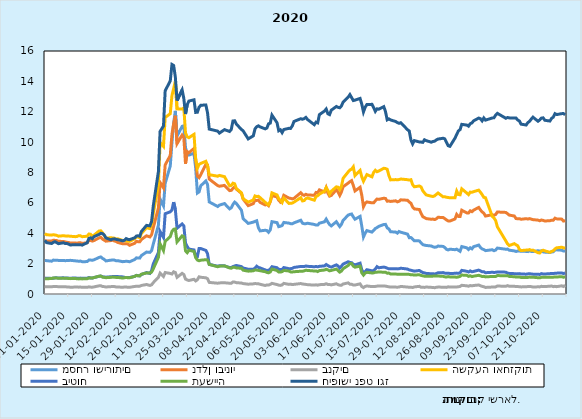
| Category | מסחר ושירותים | נדלן ובינוי | בנקים | השקעה ואחזקות | ביטוח | תעשייה | חיפושי נפט וגז |
|---|---|---|---|---|---|---|---|
| 2020-01-01 | 2.218 | 3.52 | 0.486 | 3.978 | 1.047 | 1.011 | 3.534 |
| 2020-01-02 | 2.195 | 3.485 | 0.48 | 3.903 | 1.035 | 1.005 | 3.383 |
| 2020-01-05 | 2.16 | 3.488 | 0.471 | 3.876 | 1.027 | 1.019 | 3.325 |
| 2020-01-06 | 2.231 | 3.538 | 0.494 | 3.905 | 1.039 | 1.056 | 3.4 |
| 2020-01-07 | 2.228 | 3.53 | 0.491 | 3.883 | 1.063 | 1.053 | 3.446 |
| 2020-01-08 | 2.229 | 3.52 | 0.49 | 3.862 | 1.062 | 1.057 | 3.381 |
| 2020-01-09 | 2.209 | 3.471 | 0.48 | 3.807 | 1.058 | 1.035 | 3.315 |
| 2020-01-12 | 2.21 | 3.457 | 0.483 | 3.838 | 1.063 | 1.038 | 3.373 |
| 2020-01-13 | 2.194 | 3.428 | 0.48 | 3.82 | 1.056 | 1.035 | 3.319 |
| 2020-01-14 | 2.201 | 3.403 | 0.464 | 3.81 | 1.047 | 1.029 | 3.323 |
| 2020-01-15 | 2.206 | 3.393 | 0.459 | 3.814 | 1.045 | 1.028 | 3.288 |
| 2020-01-16 | 2.217 | 3.356 | 0.448 | 3.804 | 1.042 | 1.012 | 3.229 |
| 2020-01-19 | 2.184 | 3.356 | 0.455 | 3.775 | 1.052 | 1.018 | 3.251 |
| 2020-01-20 | 2.168 | 3.346 | 0.463 | 3.789 | 1.042 | 1.002 | 3.235 |
| 2020-01-21 | 2.16 | 3.37 | 0.45 | 3.842 | 1.037 | 0.995 | 3.247 |
| 2020-01-22 | 2.166 | 3.374 | 0.458 | 3.83 | 1.046 | 1 | 3.247 |
| 2020-01-23 | 2.129 | 3.337 | 0.441 | 3.774 | 1.03 | 0.995 | 3.219 |
| 2020-01-26 | 2.133 | 3.371 | 0.442 | 3.805 | 1.04 | 1.004 | 3.378 |
| 2020-01-27 | 2.238 | 3.527 | 0.471 | 3.951 | 1.084 | 1.06 | 3.662 |
| 2020-01-28 | 2.235 | 3.525 | 0.453 | 3.933 | 1.056 | 1.055 | 3.702 |
| 2020-01-29 | 2.222 | 3.485 | 0.449 | 3.822 | 1.052 | 1.045 | 3.641 |
| 2020-01-30 | 2.251 | 3.52 | 0.467 | 3.876 | 1.084 | 1.083 | 3.779 |
| 2020-02-02 | 2.407 | 3.693 | 0.539 | 4.147 | 1.166 | 1.174 | 3.922 |
| 2020-02-03 | 2.441 | 3.733 | 0.543 | 4.159 | 1.184 | 1.183 | 3.999 |
| 2020-02-04 | 2.347 | 3.616 | 0.496 | 4.037 | 1.132 | 1.111 | 3.976 |
| 2020-02-05 | 2.283 | 3.548 | 0.484 | 3.877 | 1.122 | 1.097 | 3.891 |
| 2020-02-06 | 2.179 | 3.479 | 0.462 | 3.686 | 1.108 | 1.074 | 3.692 |
| 2020-02-09 | 2.228 | 3.519 | 0.485 | 3.702 | 1.136 | 1.096 | 3.568 |
| 2020-02-10 | 2.236 | 3.541 | 0.498 | 3.692 | 1.147 | 1.115 | 3.619 |
| 2020-02-11 | 2.234 | 3.49 | 0.488 | 3.678 | 1.145 | 1.104 | 3.632 |
| 2020-02-12 | 2.188 | 3.465 | 0.465 | 3.604 | 1.147 | 1.092 | 3.599 |
| 2020-02-13 | 2.195 | 3.393 | 0.465 | 3.635 | 1.147 | 1.093 | 3.576 |
| 2020-02-16 | 2.128 | 3.306 | 0.439 | 3.524 | 1.126 | 1.049 | 3.5 |
| 2020-02-17 | 2.144 | 3.307 | 0.464 | 3.511 | 1.097 | 1.073 | 3.544 |
| 2020-02-18 | 2.154 | 3.316 | 0.459 | 3.511 | 1.089 | 1.089 | 3.648 |
| 2020-02-19 | 2.146 | 3.292 | 0.444 | 3.475 | 1.085 | 1.068 | 3.595 |
| 2020-02-20 | 2.123 | 3.207 | 0.441 | 3.465 | 1.085 | 1.068 | 3.578 |
| 2020-02-23 | 2.271 | 3.339 | 0.497 | 3.629 | 1.16 | 1.161 | 3.702 |
| 2020-02-24 | 2.38 | 3.464 | 0.511 | 3.779 | 1.226 | 1.222 | 3.816 |
| 2020-02-25 | 2.372 | 3.441 | 0.501 | 3.744 | 1.206 | 1.194 | 3.834 |
| 2020-02-26 | 2.364 | 3.437 | 0.513 | 3.703 | 1.188 | 1.205 | 3.798 |
| 2020-02-27 | 2.532 | 3.593 | 0.564 | 3.99 | 1.285 | 1.306 | 4.122 |
| 2020-03-01 | 2.762 | 3.833 | 0.625 | 4.364 | 1.412 | 1.384 | 4.518 |
| 2020-03-03 | 2.739 | 3.758 | 0.562 | 4.306 | 1.355 | 1.376 | 4.487 |
| 2020-03-04 | 2.863 | 3.904 | 0.605 | 4.6 | 1.548 | 1.447 | 4.785 |
| 2020-03-05 | 3.297 | 4.372 | 0.752 | 5.306 | 1.986 | 1.664 | 5.82 |
| 2020-03-08 | 4.526 | 5.671 | 1.098 | 7.184 | 2.733 | 2.412 | 8.056 |
| 2020-03-09 | 6.259 | 7.345 | 1.372 | 9.979 | 4.116 | 3.312 | 10.701 |
| 2020-03-11 | 5.809 | 6.989 | 1.154 | 9.719 | 3.72 | 2.865 | 11.064 |
| 2020-03-12 | 7.287 | 8.5 | 1.414 | 11.624 | 5.287 | 3.468 | 13.384 |
| 2020-03-15 | 8.431 | 9.124 | 1.354 | 11.871 | 5.411 | 3.777 | 14.027 |
| 2020-03-16 | 9.971 | 10.514 | 1.316 | 13.069 | 5.533 | 4.12 | 15.114 |
| 2020-03-17 | 11.264 | 11.224 | 1.46 | 13.532 | 6.051 | 4.26 | 15.045 |
| 2020-03-18 | 12.058 | 11.738 | 1.415 | 13.989 | 5.55 | 4.283 | 14.286 |
| 2020-03-19 | 10.396 | 9.901 | 1.098 | 12.191 | 4.332 | 3.429 | 12.737 |
| 2020-03-22 | 11.039 | 10.465 | 1.358 | 12.174 | 4.612 | 3.828 | 13.435 |
| 2020-03-23 | 11.073 | 10.317 | 1.285 | 12.254 | 4.485 | 3.771 | 12.874 |
| 2020-03-24 | 9.625 | 8.576 | 0.981 | 10.596 | 3.358 | 2.839 | 11.852 |
| 2020-03-25 | 9.234 | 9.378 | 0.926 | 10.348 | 3.125 | 2.72 | 12.462 |
| 2020-03-26 | 9.148 | 9.302 | 0.89 | 10.291 | 2.958 | 2.884 | 12.703 |
| 2020-03-29 | 9.268 | 9.581 | 0.969 | 10.512 | 2.902 | 2.8 | 12.788 |
| 2020-03-30 | 8.282 | 8.843 | 0.861 | 8.921 | 2.49 | 2.393 | 11.957 |
| 2020-03-31 | 6.647 | 7.759 | 0.94 | 8.286 | 2.465 | 2.24 | 11.966 |
| 2020-04-01 | 6.722 | 7.662 | 1.131 | 8.534 | 2.993 | 2.186 | 12.295 |
| 2020-04-02 | 7.126 | 7.854 | 1.101 | 8.598 | 2.995 | 2.226 | 12.426 |
| 2020-04-05 | 7.441 | 8.533 | 1.067 | 8.737 | 2.87 | 2.258 | 12.448 |
| 2020-04-06 | 7.206 | 8.485 | 1.007 | 8.453 | 2.649 | 2.238 | 11.926 |
| 2020-04-07 | 6.061 | 7.566 | 0.763 | 7.855 | 1.952 | 1.947 | 10.86 |
| 2020-04-12 | 5.762 | 7.136 | 0.71 | 7.756 | 1.829 | 1.795 | 10.724 |
| 2020-04-13 | 5.853 | 7.096 | 0.731 | 7.808 | 1.859 | 1.832 | 10.596 |
| 2020-04-16 | 5.954 | 7.15 | 0.74 | 7.726 | 1.852 | 1.852 | 10.821 |
| 2020-04-19 | 5.605 | 6.808 | 0.71 | 7.119 | 1.743 | 1.716 | 10.702 |
| 2020-04-20 | 5.679 | 6.824 | 0.706 | 7.155 | 1.743 | 1.696 | 10.835 |
| 2020-04-21 | 5.897 | 6.959 | 0.793 | 7.295 | 1.807 | 1.76 | 11.394 |
| 2020-04-22 | 6.05 | 7.045 | 0.782 | 7.254 | 1.845 | 1.758 | 11.405 |
| 2020-04-23 | 5.962 | 6.905 | 0.748 | 6.944 | 1.879 | 1.716 | 11.188 |
| 2020-04-26 | 5.516 | 6.63 | 0.721 | 6.662 | 1.804 | 1.692 | 10.831 |
| 2020-04-27 | 4.962 | 6.252 | 0.686 | 6.272 | 1.71 | 1.566 | 10.742 |
| 2020-04-30 | 4.647 | 5.817 | 0.646 | 6.05 | 1.632 | 1.504 | 10.211 |
| 2020-05-03 | 4.734 | 5.953 | 0.667 | 6.193 | 1.634 | 1.527 | 10.414 |
| 2020-05-04 | 4.779 | 6.177 | 0.689 | 6.458 | 1.699 | 1.579 | 10.869 |
| 2020-05-05 | 4.823 | 6.156 | 0.678 | 6.42 | 1.83 | 1.571 | 11.014 |
| 2020-05-06 | 4.364 | 6.186 | 0.676 | 6.432 | 1.749 | 1.557 | 11.073 |
| 2020-05-07 | 4.156 | 6.034 | 0.641 | 6.345 | 1.719 | 1.532 | 11.005 |
| 2020-05-10 | 4.197 | 5.864 | 0.559 | 6.038 | 1.587 | 1.468 | 10.873 |
| 2020-05-11 | 4.179 | 5.914 | 0.599 | 5.936 | 1.543 | 1.422 | 10.93 |
| 2020-05-12 | 4.065 | 5.816 | 0.591 | 5.867 | 1.567 | 1.394 | 11.209 |
| 2020-05-13 | 4.222 | 6.073 | 0.632 | 6.091 | 1.638 | 1.448 | 11.249 |
| 2020-05-14 | 4.765 | 6.473 | 0.7 | 6.659 | 1.797 | 1.642 | 11.777 |
| 2020-05-17 | 4.699 | 6.396 | 0.622 | 6.523 | 1.732 | 1.546 | 11.276 |
| 2020-05-18 | 4.434 | 6.173 | 0.582 | 6.267 | 1.625 | 1.444 | 10.748 |
| 2020-05-19 | 4.464 | 6.053 | 0.567 | 6.175 | 1.613 | 1.441 | 10.811 |
| 2020-05-20 | 4.508 | 6.18 | 0.6 | 6.028 | 1.623 | 1.475 | 10.624 |
| 2020-05-21 | 4.711 | 6.5 | 0.7 | 6.318 | 1.742 | 1.552 | 10.831 |
| 2020-05-24 | 4.666 | 6.316 | 0.634 | 5.966 | 1.666 | 1.514 | 10.908 |
| 2020-05-25 | 4.632 | 6.297 | 0.65 | 5.969 | 1.669 | 1.456 | 10.902 |
| 2020-05-26 | 4.624 | 6.263 | 0.621 | 5.989 | 1.688 | 1.45 | 11.066 |
| 2020-05-27 | 4.684 | 6.299 | 0.634 | 6.049 | 1.749 | 1.467 | 11.361 |
| 2020-05-31 | 4.856 | 6.67 | 0.689 | 6.342 | 1.814 | 1.498 | 11.543 |
| 2020-06-01 | 4.664 | 6.542 | 0.658 | 6.128 | 1.807 | 1.497 | 11.507 |
| 2020-06-02 | 4.628 | 6.495 | 0.647 | 6.153 | 1.807 | 1.525 | 11.547 |
| 2020-06-03 | 4.631 | 6.563 | 0.632 | 6.28 | 1.843 | 1.562 | 11.627 |
| 2020-06-04 | 4.66 | 6.52 | 0.614 | 6.323 | 1.823 | 1.552 | 11.489 |
| 2020-06-08 | 4.58 | 6.503 | 0.585 | 6.177 | 1.795 | 1.515 | 11.146 |
| 2020-06-09 | 4.542 | 6.688 | 0.606 | 6.415 | 1.813 | 1.521 | 11.317 |
| 2020-06-10 | 4.543 | 6.669 | 0.581 | 6.474 | 1.792 | 1.478 | 11.271 |
| 2020-06-11 | 4.663 | 6.857 | 0.613 | 6.576 | 1.821 | 1.541 | 11.812 |
| 2020-06-14 | 4.754 | 6.719 | 0.633 | 6.767 | 1.852 | 1.578 | 12.045 |
| 2020-06-15 | 4.931 | 6.997 | 0.677 | 7.013 | 1.942 | 1.631 | 12.178 |
| 2020-06-16 | 4.732 | 6.64 | 0.627 | 6.824 | 1.871 | 1.586 | 11.87 |
| 2020-06-17 | 4.575 | 6.445 | 0.624 | 6.574 | 1.806 | 1.526 | 11.812 |
| 2020-06-18 | 4.483 | 6.49 | 0.6 | 6.766 | 1.774 | 1.552 | 12.103 |
| 2020-06-21 | 4.761 | 6.862 | 0.672 | 7.056 | 1.92 | 1.639 | 12.347 |
| 2020-06-22 | 4.594 | 6.715 | 0.614 | 7.032 | 1.846 | 1.547 | 12.29 |
| 2020-06-23 | 4.44 | 6.493 | 0.582 | 6.869 | 1.709 | 1.44 | 12.262 |
| 2020-06-24 | 4.585 | 6.722 | 0.578 | 7.093 | 1.83 | 1.51 | 12.383 |
| 2020-06-25 | 4.853 | 7.062 | 0.659 | 7.621 | 1.97 | 1.666 | 12.635 |
| 2020-06-28 | 5.194 | 7.305 | 0.732 | 8.04 | 2.124 | 1.88 | 12.966 |
| 2020-06-29 | 5.243 | 7.395 | 0.647 | 8.168 | 2.076 | 2.003 | 13.127 |
| 2020-06-30 | 5.267 | 7.464 | 0.64 | 8.22 | 2.062 | 2.005 | 12.932 |
| 2020-07-01 | 5.079 | 7.153 | 0.593 | 8.373 | 1.964 | 1.833 | 12.737 |
| 2020-07-02 | 4.923 | 6.786 | 0.592 | 7.794 | 1.915 | 1.766 | 12.765 |
| 2020-07-05 | 5.11 | 7.027 | 0.668 | 8.132 | 2.029 | 1.837 | 12.875 |
| 2020-07-06 | 4.471 | 6.506 | 0.49 | 7.714 | 1.603 | 1.395 | 12.5 |
| 2020-07-07 | 3.753 | 5.746 | 0.422 | 7.425 | 1.363 | 1.246 | 11.986 |
| 2020-07-08 | 3.998 | 5.974 | 0.499 | 7.643 | 1.48 | 1.379 | 12.293 |
| 2020-07-09 | 4.177 | 6.062 | 0.53 | 7.865 | 1.598 | 1.428 | 12.477 |
| 2020-07-12 | 4.075 | 6.003 | 0.486 | 7.715 | 1.529 | 1.386 | 12.488 |
| 2020-07-13 | 4.189 | 6.003 | 0.487 | 8.007 | 1.545 | 1.391 | 12.273 |
| 2020-07-14 | 4.313 | 6.137 | 0.5 | 8.146 | 1.647 | 1.435 | 12.026 |
| 2020-07-15 | 4.373 | 6.252 | 0.518 | 8.05 | 1.802 | 1.438 | 12.193 |
| 2020-07-16 | 4.452 | 6.232 | 0.529 | 8.097 | 1.727 | 1.449 | 12.17 |
| 2020-07-19 | 4.576 | 6.306 | 0.524 | 8.278 | 1.772 | 1.434 | 12.334 |
| 2020-07-20 | 4.584 | 6.292 | 0.518 | 8.262 | 1.748 | 1.433 | 12.004 |
| 2020-07-21 | 4.353 | 6.11 | 0.496 | 8.209 | 1.698 | 1.372 | 11.469 |
| 2020-07-22 | 4.282 | 6.121 | 0.473 | 7.798 | 1.658 | 1.377 | 11.53 |
| 2020-07-23 | 4.099 | 6.095 | 0.458 | 7.514 | 1.657 | 1.321 | 11.46 |
| 2020-07-26 | 4.078 | 6.136 | 0.455 | 7.533 | 1.661 | 1.313 | 11.358 |
| 2020-07-27 | 4.008 | 6.067 | 0.448 | 7.517 | 1.653 | 1.303 | 11.286 |
| 2020-07-28 | 4.114 | 6.102 | 0.46 | 7.535 | 1.664 | 1.303 | 11.239 |
| 2020-07-29 | 4.069 | 6.201 | 0.499 | 7.572 | 1.697 | 1.306 | 11.28 |
| 2020-08-02 | 3.944 | 6.173 | 0.456 | 7.526 | 1.643 | 1.304 | 10.816 |
| 2020-08-03 | 3.707 | 6.06 | 0.446 | 7.503 | 1.588 | 1.29 | 10.735 |
| 2020-08-04 | 3.717 | 5.976 | 0.443 | 7.525 | 1.563 | 1.265 | 10.143 |
| 2020-08-05 | 3.617 | 5.728 | 0.428 | 7.2 | 1.533 | 1.261 | 9.885 |
| 2020-08-06 | 3.509 | 5.603 | 0.466 | 7.06 | 1.505 | 1.255 | 10.101 |
| 2020-08-09 | 3.497 | 5.561 | 0.505 | 7.114 | 1.55 | 1.262 | 10.011 |
| 2020-08-10 | 3.36 | 5.304 | 0.439 | 7.046 | 1.475 | 1.224 | 10.005 |
| 2020-08-11 | 3.25 | 5.093 | 0.439 | 6.8 | 1.413 | 1.195 | 9.984 |
| 2020-08-12 | 3.218 | 5.034 | 0.435 | 6.657 | 1.389 | 1.174 | 10.155 |
| 2020-08-13 | 3.196 | 4.964 | 0.459 | 6.525 | 1.356 | 1.164 | 10.098 |
| 2020-08-16 | 3.162 | 4.922 | 0.437 | 6.44 | 1.333 | 1.171 | 9.996 |
| 2020-08-17 | 3.107 | 4.934 | 0.43 | 6.42 | 1.335 | 1.177 | 10.041 |
| 2020-08-18 | 3.08 | 4.901 | 0.413 | 6.464 | 1.316 | 1.183 | 10.062 |
| 2020-08-19 | 3.093 | 4.955 | 0.445 | 6.561 | 1.351 | 1.178 | 10.146 |
| 2020-08-20 | 3.156 | 5.049 | 0.456 | 6.651 | 1.397 | 1.182 | 10.201 |
| 2020-08-23 | 3.133 | 5.038 | 0.449 | 6.396 | 1.409 | 1.164 | 10.255 |
| 2020-08-24 | 3.06 | 4.959 | 0.446 | 6.404 | 1.375 | 1.129 | 10.213 |
| 2020-08-25 | 2.937 | 4.875 | 0.434 | 6.369 | 1.361 | 1.119 | 9.987 |
| 2020-08-26 | 2.903 | 4.813 | 0.474 | 6.355 | 1.369 | 1.146 | 9.763 |
| 2020-08-27 | 2.951 | 4.803 | 0.454 | 6.33 | 1.352 | 1.124 | 9.722 |
| 2020-08-30 | 2.918 | 4.94 | 0.46 | 6.337 | 1.36 | 1.115 | 10.262 |
| 2020-08-31 | 2.953 | 5.241 | 0.463 | 6.777 | 1.376 | 1.104 | 10.504 |
| 2020-09-01 | 2.877 | 5.109 | 0.476 | 6.549 | 1.362 | 1.125 | 10.735 |
| 2020-09-02 | 2.811 | 5.101 | 0.498 | 6.533 | 1.392 | 1.16 | 10.825 |
| 2020-09-03 | 3.124 | 5.516 | 0.572 | 6.924 | 1.555 | 1.248 | 11.17 |
| 2020-09-06 | 3.038 | 5.338 | 0.537 | 6.644 | 1.495 | 1.226 | 11.122 |
| 2020-09-07 | 2.932 | 5.335 | 0.514 | 6.545 | 1.448 | 1.163 | 11.051 |
| 2020-09-08 | 3.043 | 5.478 | 0.557 | 6.709 | 1.522 | 1.202 | 11.216 |
| 2020-09-09 | 2.973 | 5.419 | 0.537 | 6.7 | 1.464 | 1.146 | 11.265 |
| 2020-09-10 | 3.115 | 5.522 | 0.56 | 6.74 | 1.487 | 1.175 | 11.403 |
| 2020-09-13 | 3.223 | 5.701 | 0.592 | 6.838 | 1.572 | 1.23 | 11.584 |
| 2020-09-14 | 3.065 | 5.534 | 0.545 | 6.704 | 1.524 | 1.198 | 11.543 |
| 2020-09-15 | 2.968 | 5.408 | 0.504 | 6.545 | 1.466 | 1.153 | 11.4 |
| 2020-09-16 | 2.926 | 5.319 | 0.479 | 6.366 | 1.467 | 1.162 | 11.591 |
| 2020-09-17 | 2.857 | 5.134 | 0.432 | 6.339 | 1.402 | 1.126 | 11.447 |
| 2020-09-21 | 2.914 | 5.22 | 0.458 | 5.109 | 1.43 | 1.156 | 11.592 |
| 2020-09-22 | 2.851 | 5.186 | 0.459 | 5.007 | 1.42 | 1.15 | 11.603 |
| 2020-09-23 | 2.894 | 5.234 | 0.468 | 4.837 | 1.426 | 1.152 | 11.784 |
| 2020-09-24 | 3.024 | 5.4 | 0.526 | 4.422 | 1.451 | 1.215 | 11.895 |
| 2020-09-29 | 2.948 | 5.372 | 0.506 | 3.495 | 1.439 | 1.194 | 11.571 |
| 2020-09-30 | 2.958 | 5.289 | 0.55 | 3.298 | 1.373 | 1.214 | 11.621 |
| 2020-10-01 | 2.886 | 5.195 | 0.515 | 3.191 | 1.357 | 1.158 | 11.597 |
| 2020-10-04 | 2.838 | 5.136 | 0.506 | 3.315 | 1.34 | 1.136 | 11.588 |
| 2020-10-05 | 2.798 | 4.97 | 0.491 | 3.239 | 1.323 | 1.116 | 11.587 |
| 2020-10-06 | 2.829 | 4.952 | 0.489 | 3.179 | 1.335 | 1.121 | 11.455 |
| 2020-10-07 | 2.825 | 4.961 | 0.482 | 2.938 | 1.342 | 1.125 | 11.392 |
| 2020-10-08 | 2.816 | 4.921 | 0.467 | 2.86 | 1.319 | 1.089 | 11.182 |
| 2020-10-11 | 2.805 | 4.961 | 0.483 | 2.891 | 1.305 | 1.085 | 11.126 |
| 2020-10-12 | 2.791 | 4.936 | 0.487 | 2.889 | 1.325 | 1.093 | 11.288 |
| 2020-10-13 | 2.848 | 4.963 | 0.5 | 2.924 | 1.334 | 1.113 | 11.369 |
| 2020-10-14 | 2.8 | 4.929 | 0.484 | 2.873 | 1.318 | 1.105 | 11.517 |
| 2020-10-15 | 2.798 | 4.897 | 0.462 | 2.889 | 1.306 | 1.106 | 11.644 |
| 2020-10-18 | 2.847 | 4.864 | 0.471 | 2.715 | 1.295 | 1.071 | 11.375 |
| 2020-10-19 | 2.826 | 4.822 | 0.468 | 2.699 | 1.29 | 1.066 | 11.462 |
| 2020-10-20 | 2.841 | 4.872 | 0.505 | 2.83 | 1.341 | 1.095 | 11.58 |
| 2020-10-21 | 2.774 | 4.845 | 0.495 | 2.883 | 1.318 | 1.109 | 11.599 |
| 2020-10-22 | 2.758 | 4.808 | 0.489 | 2.842 | 1.318 | 1.104 | 11.44 |
| 2020-10-25 | 2.733 | 4.824 | 0.513 | 2.743 | 1.339 | 1.103 | 11.388 |
| 2020-10-26 | 2.767 | 4.857 | 0.526 | 2.803 | 1.357 | 1.097 | 11.569 |
| 2020-10-27 | 2.78 | 4.86 | 0.486 | 2.846 | 1.346 | 1.107 | 11.643 |
| 2020-10-28 | 2.899 | 4.992 | 0.505 | 2.97 | 1.365 | 1.127 | 11.874 |
| 2020-10-29 | 2.908 | 4.946 | 0.483 | 3.04 | 1.373 | 1.122 | 11.814 |
| 2020-11-01 | 2.883 | 4.93 | 0.538 | 3.081 | 1.385 | 1.137 | 11.876 |
| 2020-11-02 | 2.829 | 4.802 | 0.493 | 3.039 | 1.344 | 1.105 | 11.88 |
| 2020-11-03 | 2.831 | 4.826 | 0.582 | 3.024 | 1.388 | 1.127 | 11.8 |